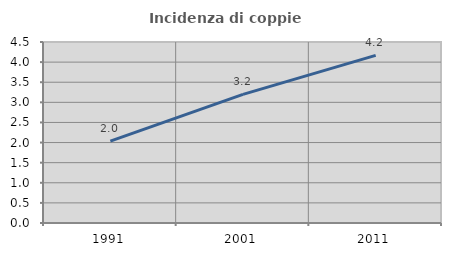
| Category | Incidenza di coppie miste |
|---|---|
| 1991.0 | 2.034 |
| 2001.0 | 3.198 |
| 2011.0 | 4.167 |